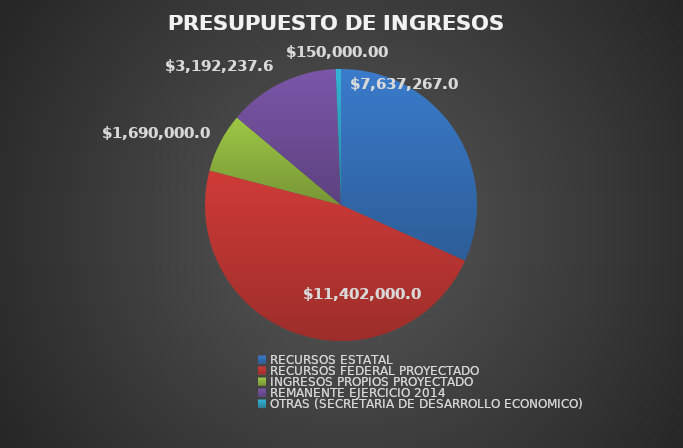
| Category | PRESUPUESTO DE INGRESOS 2015 |
|---|---|
| RECURSOS ESTATAL | 7637267 |
| RECURSOS FEDERAL PROYECTADO | 11402000 |
| INGRESOS PROPIOS PROYECTADO | 1690000 |
| REMANENTE EJERCICIO 2014 | 3192237.69 |
| OTRAS (SECRETARIA DE DESARROLLO ECONOMICO) | 150000 |